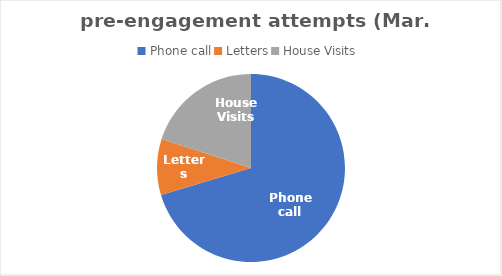
| Category | Series 0 |
|---|---|
| Phone call | 102 |
| Letters | 14 |
| House Visits | 29 |